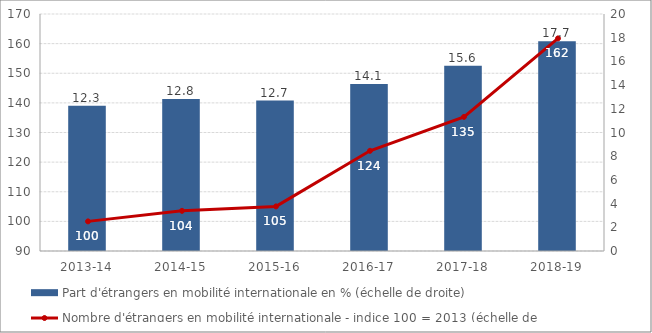
| Category | Part d'étrangers en mobilité internationale en % (échelle de droite) |
|---|---|
| 2013-14 | 12.262 |
| 2014-15 | 12.829 |
| 2015-16 | 12.696 |
| 2016-17 | 14.095 |
| 2017-18 | 15.641 |
| 2018-19 | 17.696 |